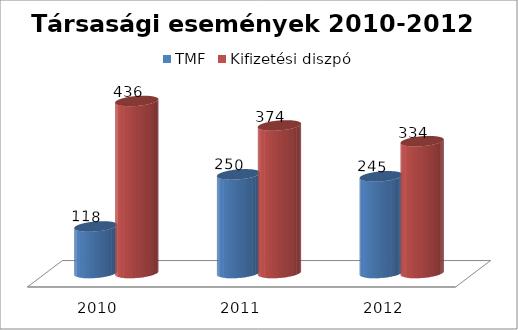
| Category | TMF | Kifizetési diszpó |
|---|---|---|
| 2010.0 | 118 | 436 |
| 2011.0 | 250 | 374 |
| 2012.0 | 245 | 334 |